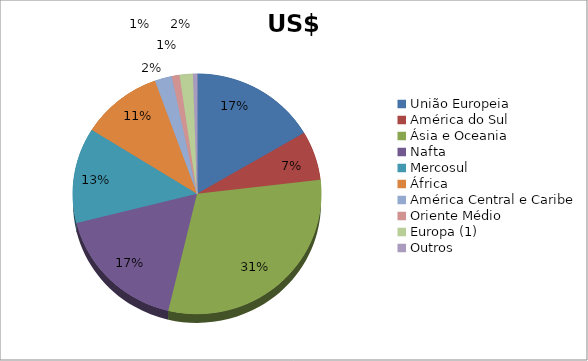
| Category | Series 0 |
|---|---|
| União Europeia | 560918230 |
| América do Sul | 224332930 |
| Ásia e Oceania | 1040117575 |
| Nafta | 590657190 |
| Mercosul | 435743473 |
| África | 359634186 |
| América Central e Caribe | 76019435 |
| Oriente Médio | 34281514 |
| Europa (1) | 58624453 |
| Outros | 17771772 |